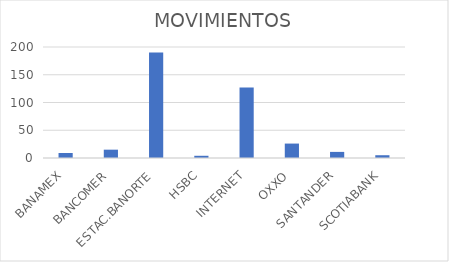
| Category | MOVIMIENTOS |
|---|---|
| BANAMEX | 9 |
| BANCOMER | 15 |
| ESTAC.BANORTE | 190 |
| HSBC | 4 |
| INTERNET | 127 |
| OXXO | 26 |
| SANTANDER | 11 |
| SCOTIABANK | 5 |